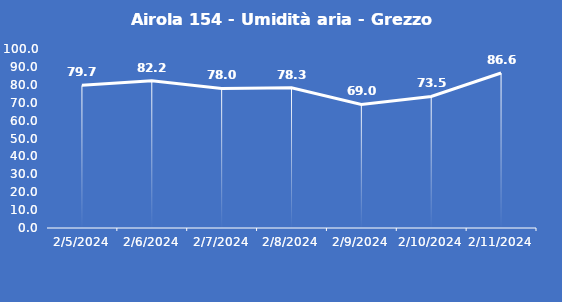
| Category | Airola 154 - Umidità aria - Grezzo (%) |
|---|---|
| 2/5/24 | 79.7 |
| 2/6/24 | 82.2 |
| 2/7/24 | 78 |
| 2/8/24 | 78.3 |
| 2/9/24 | 69 |
| 2/10/24 | 73.5 |
| 2/11/24 | 86.6 |